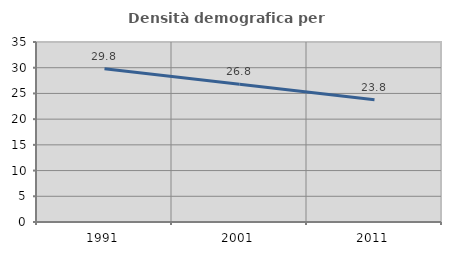
| Category | Densità demografica |
|---|---|
| 1991.0 | 29.785 |
| 2001.0 | 26.771 |
| 2011.0 | 23.783 |